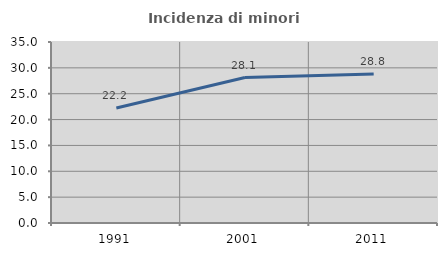
| Category | Incidenza di minori stranieri |
|---|---|
| 1991.0 | 22.222 |
| 2001.0 | 28.125 |
| 2011.0 | 28.797 |